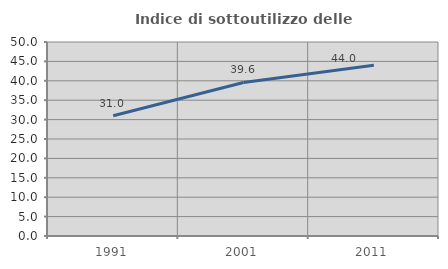
| Category | Indice di sottoutilizzo delle abitazioni  |
|---|---|
| 1991.0 | 30.98 |
| 2001.0 | 39.567 |
| 2011.0 | 43.99 |